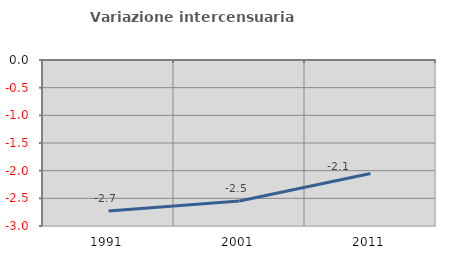
| Category | Variazione intercensuaria annua |
|---|---|
| 1991.0 | -2.729 |
| 2001.0 | -2.55 |
| 2011.0 | -2.052 |